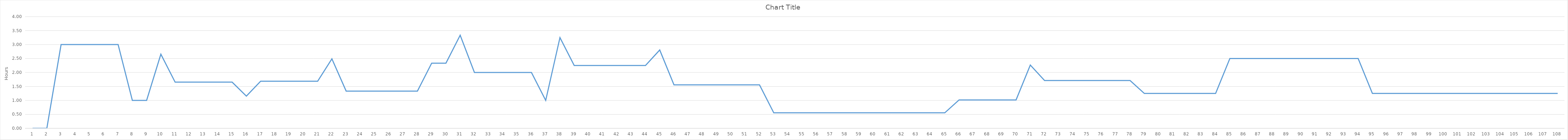
| Category | Series 0 |
|---|---|
| 0 | 0 |
| 1 | 0 |
| 2 | 3 |
| 3 | 3 |
| 4 | 3 |
| 5 | 3 |
| 6 | 3 |
| 7 | 1 |
| 8 | 1 |
| 9 | 2.654 |
| 10 | 1.654 |
| 11 | 1.654 |
| 12 | 1.654 |
| 13 | 1.654 |
| 14 | 1.654 |
| 15 | 1.154 |
| 16 | 1.687 |
| 17 | 1.687 |
| 18 | 1.687 |
| 19 | 1.687 |
| 20 | 1.687 |
| 21 | 2.487 |
| 22 | 1.333 |
| 23 | 1.333 |
| 24 | 1.333 |
| 25 | 1.333 |
| 26 | 1.333 |
| 27 | 1.333 |
| 28 | 2.333 |
| 29 | 2.333 |
| 30 | 3.333 |
| 31 | 2 |
| 32 | 2 |
| 33 | 2 |
| 34 | 2 |
| 35 | 2 |
| 36 | 1 |
| 37 | 3.25 |
| 38 | 2.25 |
| 39 | 2.25 |
| 40 | 2.25 |
| 41 | 2.25 |
| 42 | 2.25 |
| 43 | 2.25 |
| 44 | 2.806 |
| 45 | 1.556 |
| 46 | 1.556 |
| 47 | 1.556 |
| 48 | 1.556 |
| 49 | 1.556 |
| 50 | 1.556 |
| 51 | 1.556 |
| 52 | 0.556 |
| 53 | 0.556 |
| 54 | 0.556 |
| 55 | 0.556 |
| 56 | 0.556 |
| 57 | 0.556 |
| 58 | 0.556 |
| 59 | 0.556 |
| 60 | 0.556 |
| 61 | 0.556 |
| 62 | 0.556 |
| 63 | 0.556 |
| 64 | 0.556 |
| 65 | 1.017 |
| 66 | 1.017 |
| 67 | 1.017 |
| 68 | 1.017 |
| 69 | 1.017 |
| 70 | 2.267 |
| 71 | 1.712 |
| 72 | 1.712 |
| 73 | 1.712 |
| 74 | 1.712 |
| 75 | 1.712 |
| 76 | 1.712 |
| 77 | 1.712 |
| 78 | 1.25 |
| 79 | 1.25 |
| 80 | 1.25 |
| 81 | 1.25 |
| 82 | 1.25 |
| 83 | 1.25 |
| 84 | 2.5 |
| 85 | 2.5 |
| 86 | 2.5 |
| 87 | 2.5 |
| 88 | 2.5 |
| 89 | 2.5 |
| 90 | 2.5 |
| 91 | 2.5 |
| 92 | 2.5 |
| 93 | 2.5 |
| 94 | 1.25 |
| 95 | 1.25 |
| 96 | 1.25 |
| 97 | 1.25 |
| 98 | 1.25 |
| 99 | 1.25 |
| 100 | 1.25 |
| 101 | 1.25 |
| 102 | 1.25 |
| 103 | 1.25 |
| 104 | 1.25 |
| 105 | 1.25 |
| 106 | 1.25 |
| 107 | 1.25 |